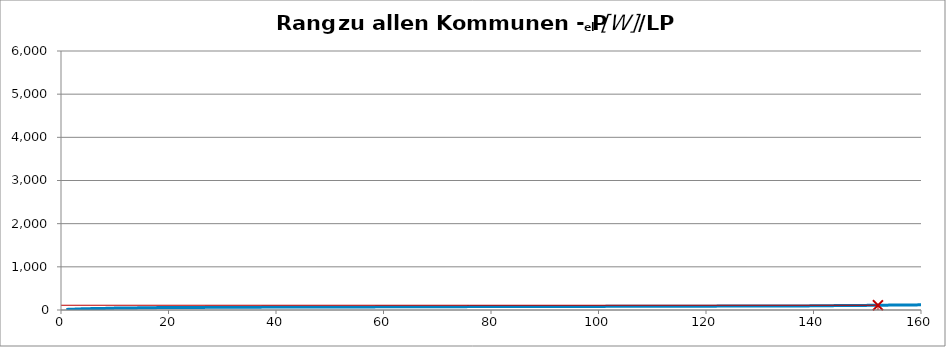
| Category | Kommunenrangfolge |
|---|---|
| 0 | 13.158 |
| 1 | 18.519 |
| 2 | 21.739 |
| 3 | 27.933 |
| 4 | 30.4 |
| 5 | 33.333 |
| 6 | 35.714 |
| 7 | 36.036 |
| 8 | 42.553 |
| 9 | 43.478 |
| 10 | 45 |
| 11 | 46.512 |
| 12 | 48.732 |
| 13 | 49.048 |
| 14 | 50 |
| 15 | 52.632 |
| 16 | 52.632 |
| 17 | 55.556 |
| 18 | 57.143 |
| 19 | 57.522 |
| 20 | 57.692 |
| 21 | 57.737 |
| 22 | 57.895 |
| 23 | 59.091 |
| 24 | 59.701 |
| 25 | 60 |
| 26 | 60.976 |
| 27 | 61.224 |
| 28 | 61.728 |
| 29 | 62.5 |
| 30 | 63.492 |
| 31 | 64.22 |
| 32 | 64.865 |
| 33 | 64.904 |
| 34 | 65.364 |
| 35 | 65.574 |
| 36 | 66.225 |
| 37 | 67.383 |
| 38 | 67.416 |
| 39 | 67.551 |
| 40 | 67.742 |
| 41 | 67.797 |
| 42 | 68.041 |
| 43 | 68.966 |
| 44 | 69.106 |
| 45 | 69.186 |
| 46 | 69.307 |
| 47 | 70 |
| 48 | 70 |
| 49 | 70 |
| 50 | 70.028 |
| 51 | 70.312 |
| 52 | 70.423 |
| 53 | 70.809 |
| 54 | 70.843 |
| 55 | 71.059 |
| 56 | 71.713 |
| 57 | 72.165 |
| 58 | 72.539 |
| 59 | 72.727 |
| 60 | 72.727 |
| 61 | 72.727 |
| 62 | 73.529 |
| 63 | 74.419 |
| 64 | 74.545 |
| 65 | 74.627 |
| 66 | 74.656 |
| 67 | 75 |
| 68 | 76.19 |
| 69 | 76.923 |
| 70 | 76.923 |
| 71 | 76.923 |
| 72 | 76.923 |
| 73 | 77.295 |
| 74 | 77.778 |
| 75 | 78.431 |
| 76 | 78.652 |
| 77 | 78.68 |
| 78 | 79.365 |
| 79 | 79.545 |
| 80 | 79.585 |
| 81 | 79.618 |
| 82 | 79.899 |
| 83 | 79.911 |
| 84 | 80 |
| 85 | 80 |
| 86 | 80.357 |
| 87 | 80.951 |
| 88 | 81.081 |
| 89 | 81.395 |
| 90 | 81.395 |
| 91 | 81.481 |
| 92 | 81.767 |
| 93 | 82.073 |
| 94 | 82.192 |
| 95 | 82.293 |
| 96 | 83.333 |
| 97 | 83.333 |
| 98 | 83.333 |
| 99 | 83.558 |
| 100 | 83.744 |
| 101 | 84.375 |
| 102 | 85 |
| 103 | 85.171 |
| 104 | 85.217 |
| 105 | 85.714 |
| 106 | 85.714 |
| 107 | 86.08 |
| 108 | 86.226 |
| 109 | 86.338 |
| 110 | 86.667 |
| 111 | 86.888 |
| 112 | 86.957 |
| 113 | 86.957 |
| 114 | 86.957 |
| 115 | 87.379 |
| 116 | 87.5 |
| 117 | 88.757 |
| 118 | 88.889 |
| 119 | 89.286 |
| 120 | 89.552 |
| 121 | 89.721 |
| 122 | 90.074 |
| 123 | 90.452 |
| 124 | 90.909 |
| 125 | 90.909 |
| 126 | 90.909 |
| 127 | 91.667 |
| 128 | 92.13 |
| 129 | 92.233 |
| 130 | 92.593 |
| 131 | 92.593 |
| 132 | 93.023 |
| 133 | 93.333 |
| 134 | 93.333 |
| 135 | 93.458 |
| 136 | 93.75 |
| 137 | 94.044 |
| 138 | 95.238 |
| 139 | 96.386 |
| 140 | 98.529 |
| 141 | 99.704 |
| 142 | 100 |
| 143 | 101.695 |
| 144 | 101.974 |
| 145 | 102.041 |
| 146 | 102.564 |
| 147 | 105.882 |
| 148 | 106.061 |
| 149 | 107.239 |
| 150 | 108.848 |
| 151 | 111.111 |
| 152 | 111.111 |
| 153 | 113.089 |
| 154 | 115.385 |
| 155 | 116.141 |
| 156 | 116.667 |
| 157 | 117.089 |
| 158 | 117.647 |
| 159 | 120.69 |
| 160 | 121.212 |
| 161 | 121.563 |
| 162 | 123.288 |
| 163 | 123.81 |
| 164 | 125 |
| 165 | 125.387 |
| 166 | 127.226 |
| 167 | 127.273 |
| 168 | 127.66 |
| 169 | 127.66 |
| 170 | 128.16 |
| 171 | 129.032 |
| 172 | 130.435 |
| 173 | 135.135 |
| 174 | 135.294 |
| 175 | 139.442 |
| 176 | 139.831 |
| 177 | 142.752 |
| 178 | 142.857 |
| 179 | 142.857 |
| 180 | 144.928 |
| 181 | 157.48 |
| 182 | 160.465 |
| 183 | 166.667 |
| 184 | 184.615 |
| 185 | 254.545 |
| 186 | 262.836 |
| 187 | 318.182 |
| 188 | 356.109 |
| 189 | 357.143 |
| 190 | 457.143 |
| 191 | 526.316 |
| 192 | 698.953 |
| 193 | 699.796 |
| 194 | 2258.065 |
| 195 | 5000 |